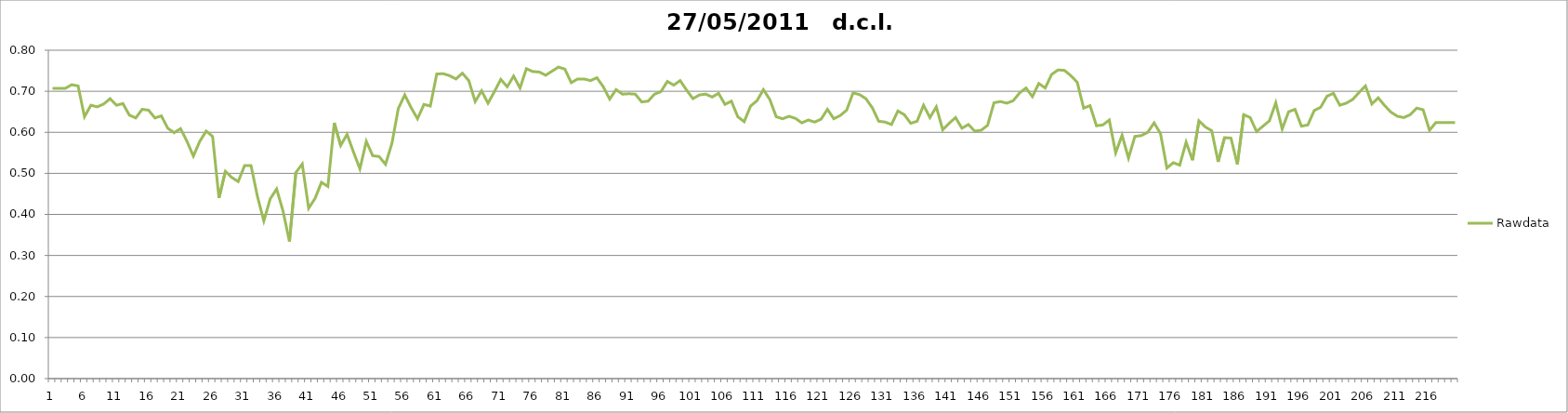
| Category | Rawdata |
|---|---|
| 0 | 0.707 |
| 1 | 0.707 |
| 2 | 0.707 |
| 3 | 0.716 |
| 4 | 0.713 |
| 5 | 0.638 |
| 6 | 0.666 |
| 7 | 0.662 |
| 8 | 0.669 |
| 9 | 0.682 |
| 10 | 0.666 |
| 11 | 0.67 |
| 12 | 0.642 |
| 13 | 0.635 |
| 14 | 0.656 |
| 15 | 0.654 |
| 16 | 0.635 |
| 17 | 0.64 |
| 18 | 0.61 |
| 19 | 0.599 |
| 20 | 0.609 |
| 21 | 0.578 |
| 22 | 0.542 |
| 23 | 0.578 |
| 24 | 0.603 |
| 25 | 0.59 |
| 26 | 0.44 |
| 27 | 0.505 |
| 28 | 0.49 |
| 29 | 0.48 |
| 30 | 0.519 |
| 31 | 0.519 |
| 32 | 0.444 |
| 33 | 0.384 |
| 34 | 0.438 |
| 35 | 0.462 |
| 36 | 0.408 |
| 37 | 0.334 |
| 38 | 0.502 |
| 39 | 0.523 |
| 40 | 0.415 |
| 41 | 0.439 |
| 42 | 0.478 |
| 43 | 0.468 |
| 44 | 0.623 |
| 45 | 0.568 |
| 46 | 0.595 |
| 47 | 0.552 |
| 48 | 0.511 |
| 49 | 0.578 |
| 50 | 0.543 |
| 51 | 0.541 |
| 52 | 0.522 |
| 53 | 0.573 |
| 54 | 0.658 |
| 55 | 0.691 |
| 56 | 0.66 |
| 57 | 0.633 |
| 58 | 0.668 |
| 59 | 0.664 |
| 60 | 0.742 |
| 61 | 0.743 |
| 62 | 0.738 |
| 63 | 0.73 |
| 64 | 0.744 |
| 65 | 0.726 |
| 66 | 0.675 |
| 67 | 0.701 |
| 68 | 0.671 |
| 69 | 0.699 |
| 70 | 0.729 |
| 71 | 0.711 |
| 72 | 0.737 |
| 73 | 0.708 |
| 74 | 0.755 |
| 75 | 0.748 |
| 76 | 0.747 |
| 77 | 0.739 |
| 78 | 0.749 |
| 79 | 0.759 |
| 80 | 0.754 |
| 81 | 0.721 |
| 82 | 0.73 |
| 83 | 0.73 |
| 84 | 0.726 |
| 85 | 0.733 |
| 86 | 0.711 |
| 87 | 0.681 |
| 88 | 0.704 |
| 89 | 0.693 |
| 90 | 0.694 |
| 91 | 0.693 |
| 92 | 0.674 |
| 93 | 0.676 |
| 94 | 0.693 |
| 95 | 0.699 |
| 96 | 0.724 |
| 97 | 0.715 |
| 98 | 0.726 |
| 99 | 0.703 |
| 100 | 0.682 |
| 101 | 0.691 |
| 102 | 0.693 |
| 103 | 0.686 |
| 104 | 0.695 |
| 105 | 0.668 |
| 106 | 0.676 |
| 107 | 0.638 |
| 108 | 0.626 |
| 109 | 0.664 |
| 110 | 0.677 |
| 111 | 0.704 |
| 112 | 0.68 |
| 113 | 0.638 |
| 114 | 0.633 |
| 115 | 0.639 |
| 116 | 0.634 |
| 117 | 0.623 |
| 118 | 0.63 |
| 119 | 0.625 |
| 120 | 0.632 |
| 121 | 0.656 |
| 122 | 0.633 |
| 123 | 0.641 |
| 124 | 0.654 |
| 125 | 0.696 |
| 126 | 0.692 |
| 127 | 0.682 |
| 128 | 0.66 |
| 129 | 0.627 |
| 130 | 0.625 |
| 131 | 0.619 |
| 132 | 0.652 |
| 133 | 0.643 |
| 134 | 0.622 |
| 135 | 0.627 |
| 136 | 0.666 |
| 137 | 0.636 |
| 138 | 0.662 |
| 139 | 0.606 |
| 140 | 0.622 |
| 141 | 0.636 |
| 142 | 0.61 |
| 143 | 0.619 |
| 144 | 0.603 |
| 145 | 0.605 |
| 146 | 0.617 |
| 147 | 0.672 |
| 148 | 0.675 |
| 149 | 0.671 |
| 150 | 0.677 |
| 151 | 0.696 |
| 152 | 0.708 |
| 153 | 0.687 |
| 154 | 0.719 |
| 155 | 0.708 |
| 156 | 0.741 |
| 157 | 0.752 |
| 158 | 0.751 |
| 159 | 0.738 |
| 160 | 0.722 |
| 161 | 0.659 |
| 162 | 0.665 |
| 163 | 0.616 |
| 164 | 0.618 |
| 165 | 0.63 |
| 166 | 0.55 |
| 167 | 0.593 |
| 168 | 0.537 |
| 169 | 0.59 |
| 170 | 0.592 |
| 171 | 0.6 |
| 172 | 0.623 |
| 173 | 0.597 |
| 174 | 0.513 |
| 175 | 0.526 |
| 176 | 0.52 |
| 177 | 0.576 |
| 178 | 0.532 |
| 179 | 0.628 |
| 180 | 0.613 |
| 181 | 0.604 |
| 182 | 0.528 |
| 183 | 0.587 |
| 184 | 0.586 |
| 185 | 0.522 |
| 186 | 0.643 |
| 187 | 0.636 |
| 188 | 0.602 |
| 189 | 0.615 |
| 190 | 0.628 |
| 191 | 0.672 |
| 192 | 0.608 |
| 193 | 0.65 |
| 194 | 0.656 |
| 195 | 0.615 |
| 196 | 0.618 |
| 197 | 0.653 |
| 198 | 0.661 |
| 199 | 0.688 |
| 200 | 0.695 |
| 201 | 0.666 |
| 202 | 0.671 |
| 203 | 0.68 |
| 204 | 0.697 |
| 205 | 0.713 |
| 206 | 0.669 |
| 207 | 0.684 |
| 208 | 0.665 |
| 209 | 0.649 |
| 210 | 0.639 |
| 211 | 0.636 |
| 212 | 0.643 |
| 213 | 0.659 |
| 214 | 0.655 |
| 215 | 0.605 |
| 216 | 0.624 |
| 217 | 0.624 |
| 218 | 0.624 |
| 219 | 0.624 |